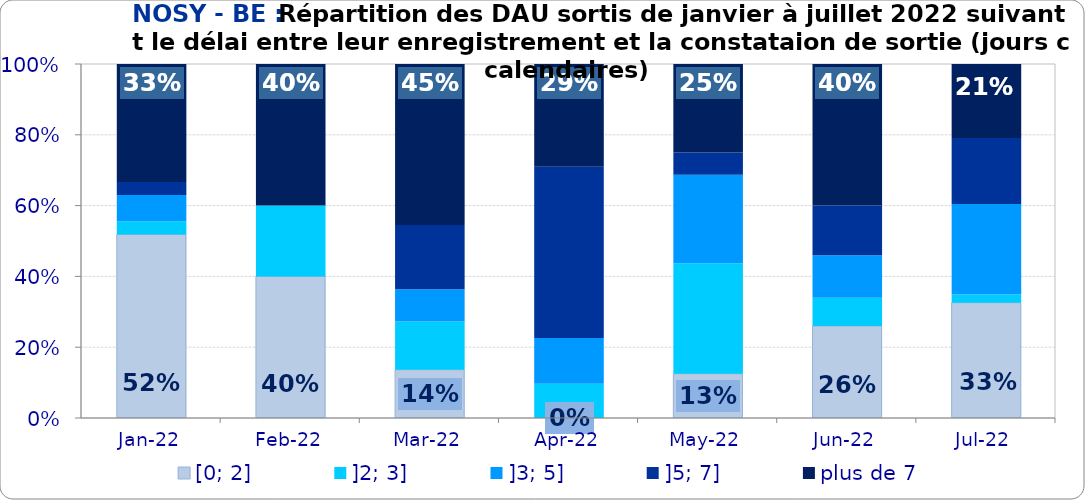
| Category | [0; 2] | ]2; 3] | ]3; 5] | ]5; 7] | plus de 7 |
|---|---|---|---|---|---|
| 2022-01-01 | 0.519 | 0.037 | 0.074 | 0.037 | 0.333 |
| 2022-02-01 | 0.4 | 0.2 | 0 | 0 | 0.4 |
| 2022-03-01 | 0.136 | 0.136 | 0.091 | 0.182 | 0.455 |
| 2022-04-01 | 0 | 0.097 | 0.129 | 0.484 | 0.29 |
| 2022-05-01 | 0.125 | 0.312 | 0.25 | 0.062 | 0.25 |
| 2022-06-01 | 0.26 | 0.08 | 0.12 | 0.14 | 0.4 |
| 2022-07-01 | 0.326 | 0.023 | 0.256 | 0.186 | 0.209 |